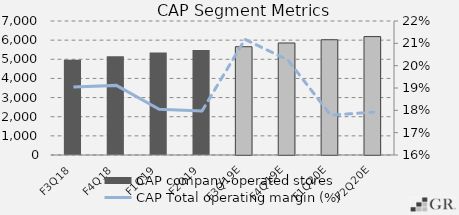
| Category | CAP company-operated stores |
|---|---|
|  F3Q18  | 4979 |
|  F4Q18  | 5159 |
|  F1Q19  | 5350 |
|  F2Q19  | 5483 |
|  F3Q19E  | 5657 |
|  F4Q19E  | 5852 |
|  F1Q20E  | 6021 |
|  F2Q20E  | 6186 |